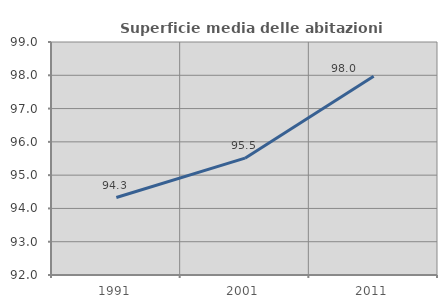
| Category | Superficie media delle abitazioni occupate |
|---|---|
| 1991.0 | 94.327 |
| 2001.0 | 95.509 |
| 2011.0 | 97.974 |